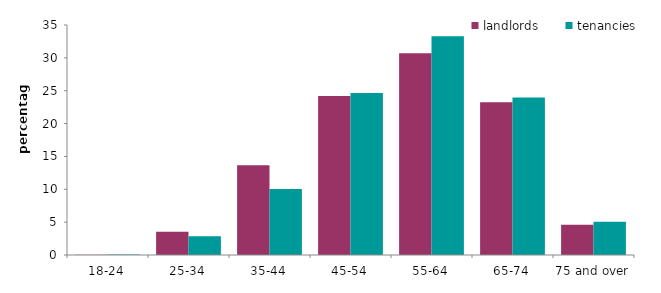
| Category | landlords | tenancies |
|---|---|---|
| 18-24 | 0.051 | 0.068 |
| 25-34 | 3.549 | 2.871 |
| 35-44 | 13.67 | 10.043 |
| 45-54 | 24.183 | 24.67 |
| 55-64 | 30.699 | 33.295 |
| 65-74 | 23.253 | 23.975 |
| 75 and over | 4.594 | 5.078 |